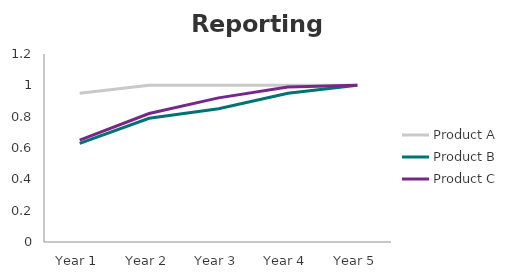
| Category | Product A | Product B | Product C |
|---|---|---|---|
| Year 1 | 0.95 | 0.63 | 0.65 |
| Year 2 | 1 | 0.79 | 0.82 |
| Year 3 | 1 | 0.85 | 0.92 |
| Year 4 | 1 | 0.95 | 0.99 |
| Year 5 | 1 | 1 | 1 |